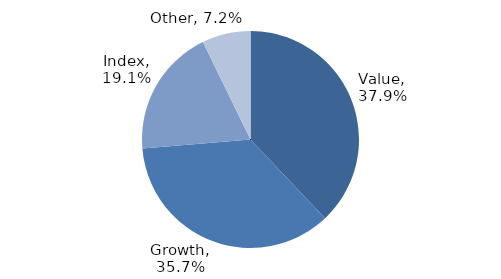
| Category | Investment Style |
|---|---|
| Value | 0.379 |
| Growth | 0.357 |
| Index | 0.191 |
| Other | 0.072 |